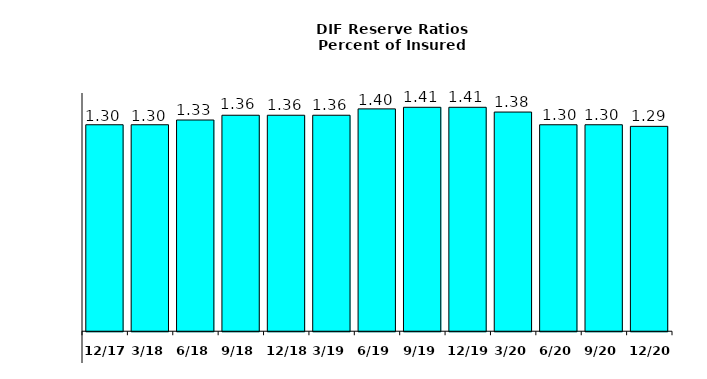
| Category | Series 0 |
|---|---|
| 12/17 | 1.3 |
| 3/18 | 1.3 |
| 6/18 | 1.33 |
| 9/18 | 1.36 |
| 12/18 | 1.36 |
| 3/19 | 1.36 |
| 6/19 | 1.4 |
| 9/19 | 1.41 |
| 12/19 | 1.41 |
| 3/20 | 1.38 |
| 6/20 | 1.3 |
| 9/20 | 1.3 |
| 12/20 | 1.29 |